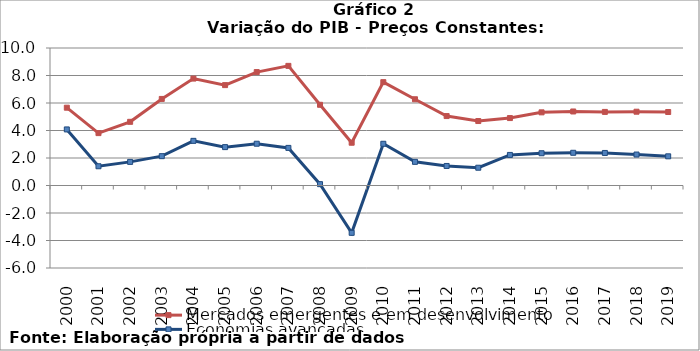
| Category | Mercados emergentes e em desenvolvimento | Economias avançadas |
|---|---|---|
| 2000.0 | 5.658 | 4.078 |
| 2001.0 | 3.81 | 1.4 |
| 2002.0 | 4.631 | 1.718 |
| 2003.0 | 6.296 | 2.134 |
| 2004.0 | 7.776 | 3.247 |
| 2005.0 | 7.301 | 2.791 |
| 2006.0 | 8.248 | 3.038 |
| 2007.0 | 8.701 | 2.735 |
| 2008.0 | 5.87 | 0.098 |
| 2009.0 | 3.111 | -3.443 |
| 2010.0 | 7.516 | 3.035 |
| 2011.0 | 6.272 | 1.72 |
| 2012.0 | 5.05 | 1.421 |
| 2013.0 | 4.688 | 1.293 |
| 2014.0 | 4.904 | 2.223 |
| 2015.0 | 5.32 | 2.346 |
| 2016.0 | 5.384 | 2.379 |
| 2017.0 | 5.352 | 2.367 |
| 2018.0 | 5.367 | 2.252 |
| 2019.0 | 5.345 | 2.122 |